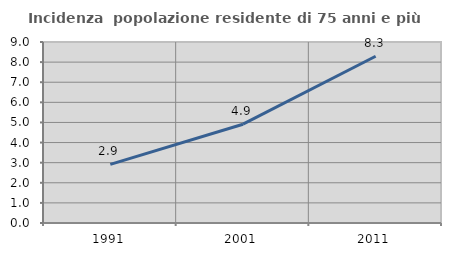
| Category | Incidenza  popolazione residente di 75 anni e più |
|---|---|
| 1991.0 | 2.917 |
| 2001.0 | 4.912 |
| 2011.0 | 8.291 |